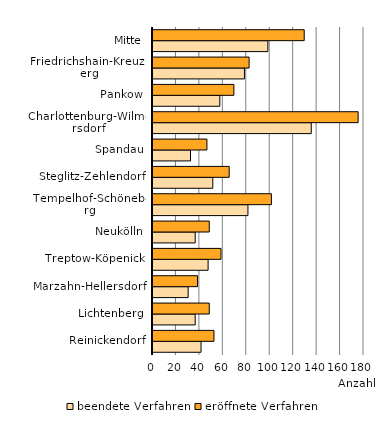
| Category | beendete Verfahren | eröffnete Verfahren |
|---|---|---|
| Reinickendorf | 41 | 52 |
| Lichtenberg | 36 | 48 |
| Marzahn-Hellersdorf | 30 | 38 |
| Treptow-Köpenick | 47 | 58 |
| Neukölln | 36 | 48 |
| Tempelhof-Schöneberg | 81 | 101 |
| Steglitz-Zehlendorf | 51 | 65 |
| Spandau | 32 | 46 |
| Charlottenburg-Wilmersdorf | 135 | 175 |
| Pankow | 57 | 69 |
| Friedrichshain-Kreuzberg | 78 | 82 |
| Mitte | 98 | 129 |